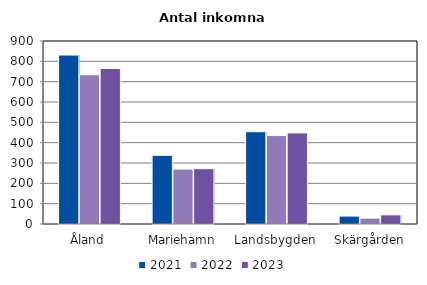
| Category | 2021 | 2022 | 2023 |
|---|---|---|---|
| Åland | 831 | 734 | 765 |
| Mariehamn | 338 | 270 | 272 |
| Landsbygden | 454 | 435 | 448 |
| Skärgården | 39 | 29 | 45 |